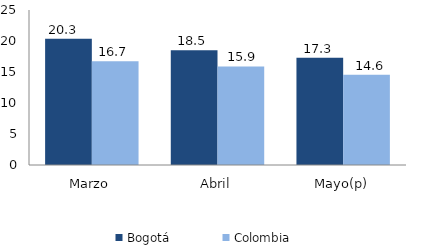
| Category | Bogotá | Colombia |
|---|---|---|
| Marzo | 20.347 | 16.724 |
| Abril | 18.492 | 15.889 |
| Mayo(p) | 17.312 | 14.562 |